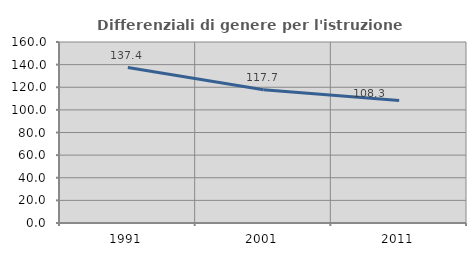
| Category | Differenziali di genere per l'istruzione superiore |
|---|---|
| 1991.0 | 137.391 |
| 2001.0 | 117.744 |
| 2011.0 | 108.276 |